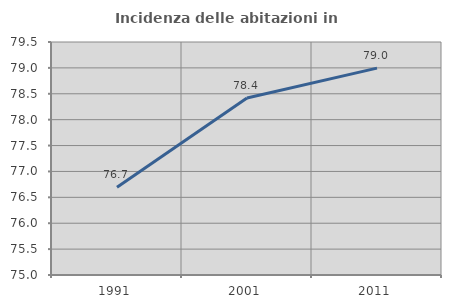
| Category | Incidenza delle abitazioni in proprietà  |
|---|---|
| 1991.0 | 76.693 |
| 2001.0 | 78.418 |
| 2011.0 | 78.995 |